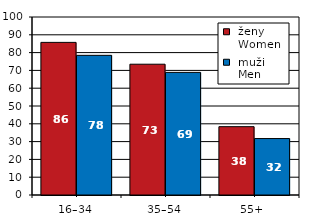
| Category |  ženy 
 Women |  muži 
 Men |
|---|---|---|
| 16–34 | 85.741 | 78.461 |
| 35–54 | 73.48 | 68.887 |
| 55+  | 38.392 | 31.714 |